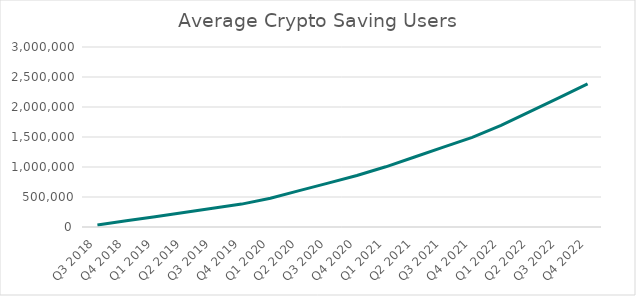
| Category | Average crypto saving users |
|---|---|
| Q3 2018 | 34452 |
| Q4 2018 | 103356 |
| Q1 2019 | 172630.25 |
| Q2 2019 | 242274.75 |
| Q3 2019 | 311919.25 |
| Q4 2019 | 381563.75 |
| Q1 2020 | 479520.875 |
| Q2 2020 | 605790.625 |
| Q3 2020 | 732060.375 |
| Q4 2020 | 858330.125 |
| Q1 2021 | 1003369.875 |
| Q2 2021 | 1167179.625 |
| Q3 2021 | 1330989.375 |
| Q4 2021 | 1494799.125 |
| Q1 2022 | 1692116 |
| Q2 2022 | 1922940 |
| Q3 2022 | 2153764 |
| Q4 2022 | 2384588 |